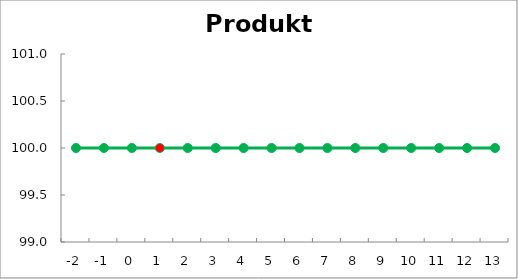
| Category | Series 1 | Produkt Y |
|---|---|---|
| -2.0 | 100 | 100 |
| -1.0 | 100 | 100 |
| 0.0 | 100 | 100 |
| 1.0 | 100 | 100 |
| 2.0 | 100 | 100 |
| 3.0 | 100 | 100 |
| 4.0 | 100 | 100 |
| 5.0 | 100 | 100 |
| 6.0 | 100 | 100 |
| 7.0 | 100 | 100 |
| 8.0 | 100 | 100 |
| 9.0 | 100 | 100 |
| 10.0 | 100 | 100 |
| 11.0 | 100 | 100 |
| 12.0 | 100 | 100 |
| 13.0 | 100 | 100 |